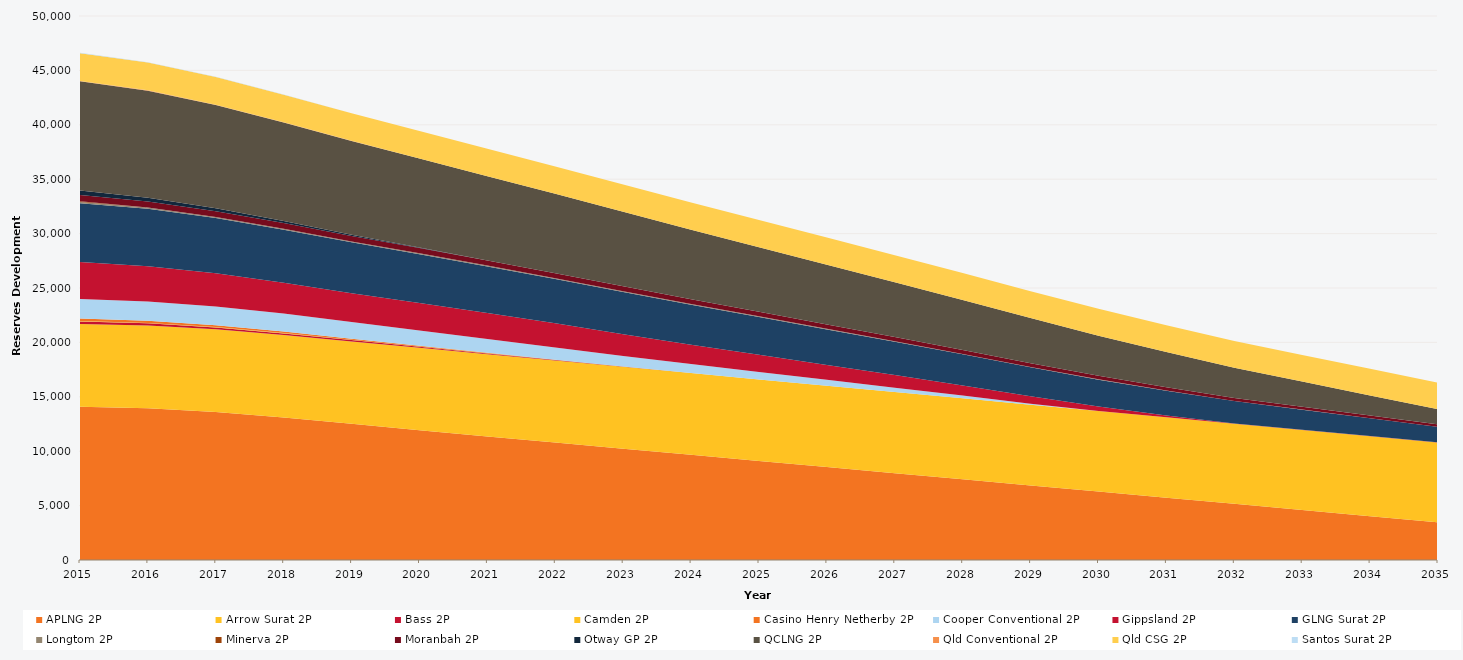
| Category | APLNG 2P | Arrow Surat 2P | Bass 2P | Camden 2P | Casino Henry Netherby 2P | Cooper Conventional 2P | Gippsland 2P | GLNG Surat 2P | Longtom 2P | Minerva 2P | Moranbah 2P | Otway GP 2P | QCLNG 2P | Qld Conventional 2P | Qld CSG 2P | Santos Surat 2P |
|---|---|---|---|---|---|---|---|---|---|---|---|---|---|---|---|---|
| 2015.0 | 14091 | 7605.789 | 221.176 | 45 | 225.66 | 1792.804 | 3415.402 | 5391 | 113.032 | 82.809 | 570 | 410.531 | 10028 | 41.53 | 2549.688 | 38.3 |
| 2016.0 | 13949.242 | 7605.789 | 196.721 | 39.525 | 196.46 | 1761.175 | 3254.491 | 5288.41 | 108.382 | 0 | 553.868 | 335.706 | 9844.919 | 41.53 | 2544.213 | 38.3 |
| 2017.0 | 13608.794 | 7599.655 | 172.199 | 34.035 | 167.18 | 1724.932 | 3039.832 | 5086.378 | 91.35 | 0 | 538.518 | 260.676 | 9487.133 | 36.822 | 2538.723 | 30.95 |
| 2018.0 | 13092.342 | 7586.639 | 147.744 | 28.56 | 137.98 | 1656.173 | 2830.741 | 4884.898 | 89.025 | 0 | 523.739 | 185.851 | 9046.74 | 28.792 | 2533.248 | 20 |
| 2019.0 | 12513.627 | 7577.094 | 123.289 | 23.085 | 108.78 | 1535.322 | 2631.301 | 4683.418 | 82.35 | 0 | 509.102 | 111.026 | 8609.46 | 20.762 | 2527.773 | 9.05 |
| 2020.0 | 11933.956 | 7567.582 | 98.834 | 17.61 | 79.58 | 1397.476 | 2534.504 | 4481.938 | 77.775 | 0 | 494.719 | 36.201 | 8172.222 | 12.732 | 2522.298 | 0 |
| 2021.0 | 11352.266 | 7557.932 | 74.312 | 12.12 | 50.3 | 1261.231 | 2394.385 | 4279.906 | 75.525 | 0 | 479.447 | 0 | 7733.442 | 4.68 | 2516.808 | 0 |
| 2022.0 | 10791.126 | 7542.186 | 49.857 | 6.645 | 21.1 | 1112.459 | 2228.256 | 4078.426 | 70.875 | 0 | 463.238 | 0 | 7291.403 | 0 | 2511.333 | 0 |
| 2023.0 | 10230.022 | 7525.78 | 25.402 | 1.17 | 0 | 966.288 | 2008.867 | 3876.946 | 70.875 | 0 | 446.737 | 0 | 6846.718 | 0 | 2505.858 | 0 |
| 2024.0 | 9669.454 | 7509.998 | 0.947 | 0 | 0 | 823.237 | 1789.291 | 3675.466 | 70.875 | 0 | 430.433 | 0 | 6395.106 | 0 | 2500.383 | 0 |
| 2025.0 | 9106.233 | 7494.5 | 0 | 0 | 0 | 680.035 | 1579.882 | 3473.434 | 59.325 | 0 | 413.771 | 0 | 5942.512 | 0 | 2494.893 | 0 |
| 2026.0 | 8544.854 | 7476.389 | 0 | 0 | 0 | 537.38 | 1363.44 | 3271.954 | 57 | 0 | 396.965 | 0 | 5494.602 | 0 | 2489.418 | 0 |
| 2027.0 | 7982.782 | 7457.886 | 0 | 0 | 0 | 394.957 | 1160.614 | 3070.474 | 40.869 | 0 | 379.805 | 0 | 5045.095 | 0 | 2483.943 | 0 |
| 2028.0 | 7419.59 | 7440.214 | 0 | 0 | 0 | 252.692 | 925.286 | 2868.904 | 38.619 | 0 | 361.888 | 0 | 4594.094 | 0 | 2478.468 | 0 |
| 2029.0 | 6854.31 | 7421.454 | 0 | 0 | 0 | 94.696 | 673.17 | 2666.021 | 38.619 | 0 | 343.551 | 0 | 4140.109 | 0 | 2472.978 | 0 |
| 2030.0 | 6290.183 | 7401.723 | 0 | 0 | 0 | 0 | 421.917 | 2462.791 | 31.644 | 0 | 324.721 | 0 | 3686.673 | 0 | 2467.503 | 0 |
| 2031.0 | 5726.066 | 7387.53 | 0 | 0 | 0 | 0 | 175.77 | 2260.163 | 20.016 | 0 | 305.919 | 0 | 3232.726 | 0 | 2462.028 | 0 |
| 2032.0 | 5161.436 | 7371.873 | 0 | 0 | 0 | 0 | 16.14 | 2056.756 | 4.191 | 0 | 286.432 | 0 | 2772.706 | 0 | 2456.553 | 0 |
| 2033.0 | 4593.357 | 7358.902 | 0 | 0 | 0 | 0 | 16.14 | 1849.968 | 4.191 | 0 | 266.667 | 0 | 2307.178 | 0 | 2451.063 | 0 |
| 2034.0 | 4026.865 | 7344.865 | 0 | 0 | 0 | 0 | 16.14 | 1642.606 | 4.191 | 0 | 246.504 | 0 | 1848.043 | 0 | 2445.588 | 0 |
| 2035.0 | 3460.17 | 7327.63 | 0 | 0 | 0 | 0 | 16.14 | 1435.544 | 4.191 | 0 | 226.211 | 0 | 1395.673 | 0 | 2440.113 | 0 |